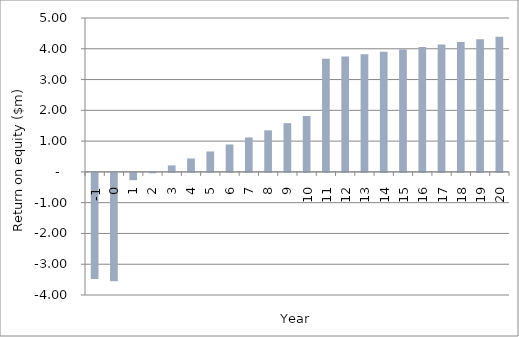
| Category | Annual return on equity |
|---|---|
| -1.0 | -3.45 |
| 0.0 | -3.519 |
| 1.0 | -0.236 |
| 2.0 | -0.013 |
| 3.0 | 0.211 |
| 4.0 | 0.436 |
| 5.0 | 0.663 |
| 6.0 | 0.891 |
| 7.0 | 1.12 |
| 8.0 | 1.351 |
| 9.0 | 1.582 |
| 10.0 | 1.816 |
| 11.0 | 3.677 |
| 12.0 | 3.75 |
| 13.0 | 3.825 |
| 14.0 | 3.902 |
| 15.0 | 3.98 |
| 16.0 | 4.059 |
| 17.0 | 4.14 |
| 18.0 | 4.223 |
| 19.0 | 4.308 |
| 20.0 | 4.394 |